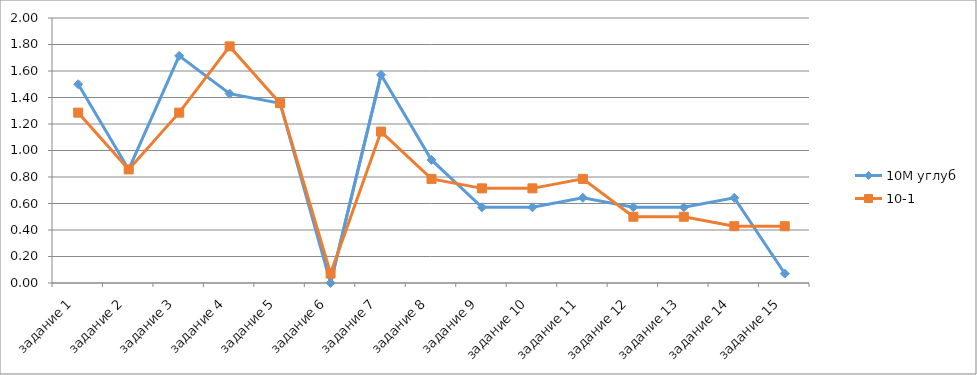
| Category | 10М углуб | 10-1 |
|---|---|---|
| задание 1 | 1.5 | 1.286 |
| задание 2 | 0.857 | 0.857 |
| задание 3 | 1.714 | 1.286 |
| задание 4 | 1.429 | 1.786 |
| задание 5 | 1.357 | 1.357 |
| задание 6 | 0 | 0.071 |
| задание 7 | 1.571 | 1.143 |
| задание 8 | 0.929 | 0.786 |
| задание 9 | 0.571 | 0.714 |
| задание 10 | 0.571 | 0.714 |
| задание 11 | 0.643 | 0.786 |
| задание 12 | 0.571 | 0.5 |
| задание 13 | 0.571 | 0.5 |
| задание 14 | 0.643 | 0.429 |
| задание 15 | 0.071 | 0.429 |